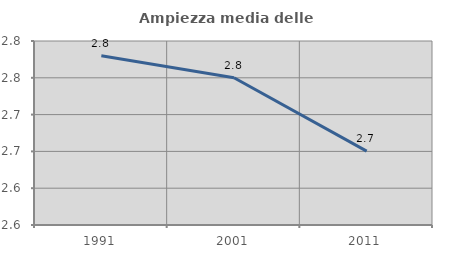
| Category | Ampiezza media delle famiglie |
|---|---|
| 1991.0 | 2.78 |
| 2001.0 | 2.75 |
| 2011.0 | 2.65 |